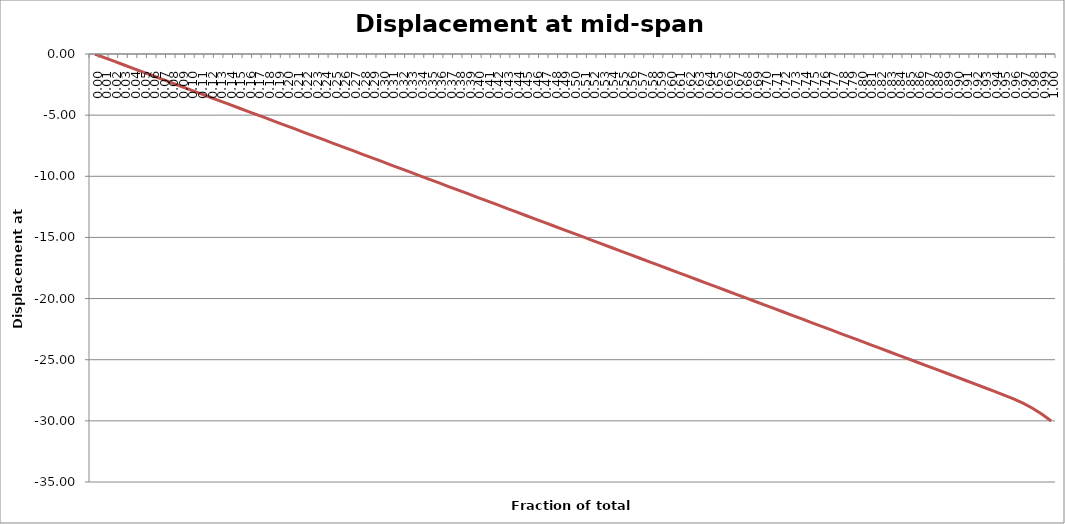
| Category | Displacement at mid-span [mm] |
|---|---|
| 0.0 | 0 |
| 0.01 | -0.293 |
| 0.02 | -0.586 |
| 0.03 | -0.878 |
| 0.04 | -1.171 |
| 0.05 | -1.464 |
| 0.06 | -1.757 |
| 0.06999999999999999 | -2.05 |
| 0.08 | -2.343 |
| 0.09 | -2.636 |
| 0.1 | -2.928 |
| 0.11000000000000001 | -3.221 |
| 0.12 | -3.514 |
| 0.13 | -3.807 |
| 0.13999999999999999 | -4.1 |
| 0.15 | -4.393 |
| 0.16 | -4.686 |
| 0.16999999999999998 | -4.979 |
| 0.18 | -5.272 |
| 0.19 | -5.565 |
| 0.2 | -5.858 |
| 0.21000000000000002 | -6.151 |
| 0.22000000000000003 | -6.444 |
| 0.22999999999999998 | -6.737 |
| 0.24 | -7.03 |
| 0.25 | -7.323 |
| 0.26 | -7.616 |
| 0.27 | -7.909 |
| 0.27999999999999997 | -8.202 |
| 0.29 | -8.495 |
| 0.3 | -8.788 |
| 0.31 | -9.081 |
| 0.32 | -9.374 |
| 0.32999999999999996 | -9.667 |
| 0.33999999999999997 | -9.96 |
| 0.35 | -10.253 |
| 0.36 | -10.546 |
| 0.37 | -10.839 |
| 0.38 | -11.132 |
| 0.39 | -11.425 |
| 0.4 | -11.718 |
| 0.41 | -12.011 |
| 0.42000000000000004 | -12.304 |
| 0.43 | -12.597 |
| 0.44000000000000006 | -12.89 |
| 0.45 | -13.184 |
| 0.45999999999999996 | -13.477 |
| 0.47000000000000003 | -13.77 |
| 0.48 | -14.063 |
| 0.49000000000000005 | -14.356 |
| 0.5 | -14.649 |
| 0.51 | -14.942 |
| 0.52 | -15.236 |
| 0.53 | -15.529 |
| 0.54 | -15.822 |
| 0.55 | -16.115 |
| 0.5599999999999999 | -16.408 |
| 0.5700000000000001 | -16.701 |
| 0.58 | -16.995 |
| 0.5900000000000001 | -17.288 |
| 0.6 | -17.581 |
| 0.61 | -17.874 |
| 0.62 | -18.167 |
| 0.63 | -18.461 |
| 0.64 | -18.754 |
| 0.65 | -19.047 |
| 0.6599999999999999 | -19.34 |
| 0.67 | -19.634 |
| 0.6799999999999999 | -19.927 |
| 0.6900000000000001 | -20.22 |
| 0.7 | -20.513 |
| 0.71 | -20.807 |
| 0.72 | -21.1 |
| 0.73 | -21.393 |
| 0.74 | -21.687 |
| 0.75 | -21.98 |
| 0.76 | -22.273 |
| 0.77 | -22.566 |
| 0.78 | -22.86 |
| 0.79 | -23.153 |
| 0.8 | -23.446 |
| 0.8099999999999999 | -23.74 |
| 0.82 | -24.033 |
| 0.8300000000000001 | -24.326 |
| 0.8400000000000001 | -24.62 |
| 0.85 | -24.913 |
| 0.86 | -25.207 |
| 0.8699999999999999 | -25.5 |
| 0.8800000000000001 | -25.794 |
| 0.89 | -26.088 |
| 0.9 | -26.383 |
| 0.9099999999999999 | -26.678 |
| 0.9199999999999999 | -26.974 |
| 0.93 | -27.272 |
| 0.9400000000000001 | -27.572 |
| 0.95 | -27.876 |
| 0.96 | -28.188 |
| 0.97 | -28.526 |
| 0.9800000000000001 | -28.95 |
| 0.99 | -29.448 |
| 1.0 | -30.006 |